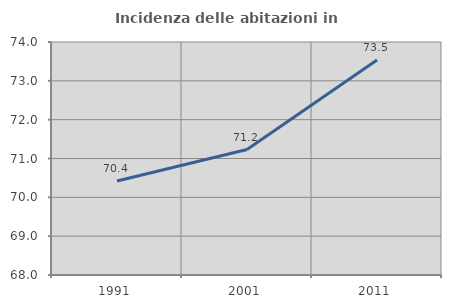
| Category | Incidenza delle abitazioni in proprietà  |
|---|---|
| 1991.0 | 70.419 |
| 2001.0 | 71.231 |
| 2011.0 | 73.536 |